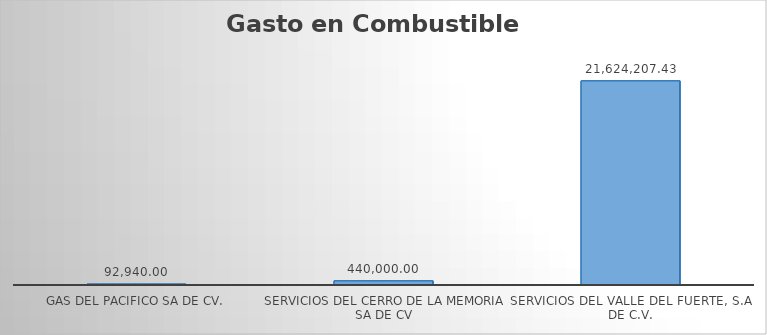
| Category | Suma |
|---|---|
| GAS DEL PACIFICO SA DE CV. | 92940 |
| SERVICIOS DEL CERRO DE LA MEMORIA SA DE CV | 440000 |
| SERVICIOS DEL VALLE DEL FUERTE, S.A. DE C.V. | 21624207.43 |